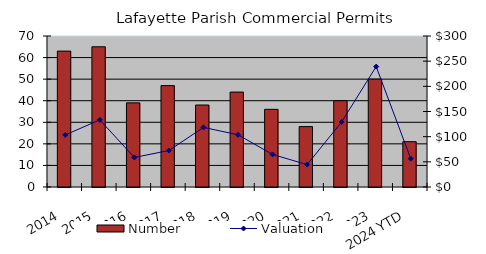
| Category | Number |
|---|---|
| 2014 | 63 |
| 2015 | 65 |
| 2016 | 39 |
| 2017 | 47 |
| 2018 | 38 |
| 2019 | 44 |
| 2020 | 36 |
| 2021 | 28 |
| 2022 | 40 |
| 2023 | 50 |
| 2024 YTD | 21 |